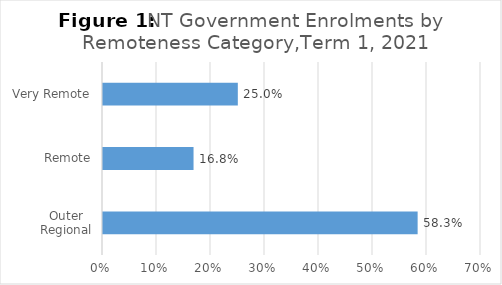
| Category | Series 0 |
|---|---|
| Outer Regional | 0.583 |
| Remote | 0.168 |
| Very Remote | 0.25 |